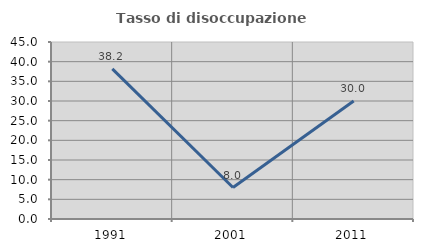
| Category | Tasso di disoccupazione giovanile  |
|---|---|
| 1991.0 | 38.182 |
| 2001.0 | 8 |
| 2011.0 | 30 |